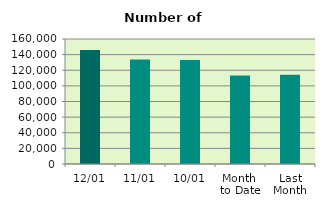
| Category | Series 0 |
|---|---|
| 12/01 | 145886 |
| 11/01 | 133750 |
| 10/01 | 132988 |
| Month 
to Date | 113183.333 |
| Last
Month | 114251.429 |